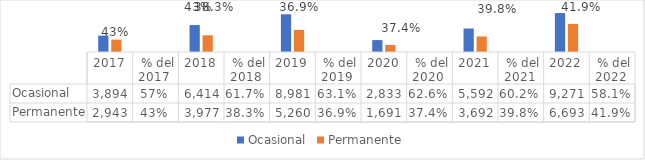
| Category | Ocasional | Permanente |
|---|---|---|
| 2017 | 3894 | 2943 |
|  % del 2017  | 0.57 | 0.43 |
| 2018 | 6414 | 3977 |
|  % del 2018  | 0.617 | 0.383 |
| 2019 | 8981 | 5260 |
|  % del 2019  | 0.631 | 0.369 |
| 2020 | 2833 | 1691 |
|  % del 2020  | 0.626 | 0.374 |
| 2021 | 5592 | 3692 |
|  % del 2021  | 0.602 | 0.398 |
| 2022 | 9271 | 6693 |
|  % del 2022  | 0.581 | 0.419 |